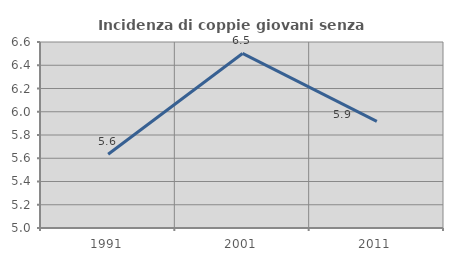
| Category | Incidenza di coppie giovani senza figli |
|---|---|
| 1991.0 | 5.634 |
| 2001.0 | 6.502 |
| 2011.0 | 5.917 |